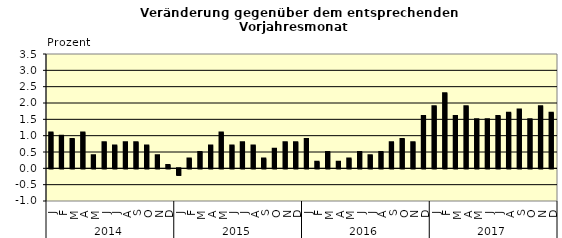
| Category | Series 0 |
|---|---|
| 0 | 1.1 |
| 1 | 1 |
| 2 | 0.9 |
| 3 | 1.1 |
| 4 | 0.4 |
| 5 | 0.8 |
| 6 | 0.7 |
| 7 | 0.8 |
| 8 | 0.8 |
| 9 | 0.7 |
| 10 | 0.4 |
| 11 | 0.1 |
| 12 | -0.2 |
| 13 | 0.3 |
| 14 | 0.5 |
| 15 | 0.7 |
| 16 | 1.1 |
| 17 | 0.7 |
| 18 | 0.8 |
| 19 | 0.7 |
| 20 | 0.3 |
| 21 | 0.6 |
| 22 | 0.8 |
| 23 | 0.8 |
| 24 | 0.9 |
| 25 | 0.2 |
| 26 | 0.5 |
| 27 | 0.2 |
| 28 | 0.3 |
| 29 | 0.5 |
| 30 | 0.4 |
| 31 | 0.5 |
| 32 | 0.8 |
| 33 | 0.9 |
| 34 | 0.8 |
| 35 | 1.6 |
| 36 | 1.9 |
| 37 | 2.3 |
| 38 | 1.6 |
| 39 | 1.9 |
| 40 | 1.5 |
| 41 | 1.5 |
| 42 | 1.6 |
| 43 | 1.7 |
| 44 | 1.8 |
| 45 | 1.5 |
| 46 | 1.9 |
| 47 | 1.7 |